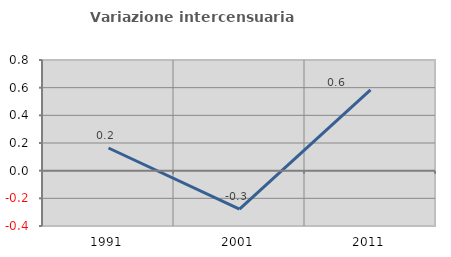
| Category | Variazione intercensuaria annua |
|---|---|
| 1991.0 | 0.164 |
| 2001.0 | -0.278 |
| 2011.0 | 0.585 |